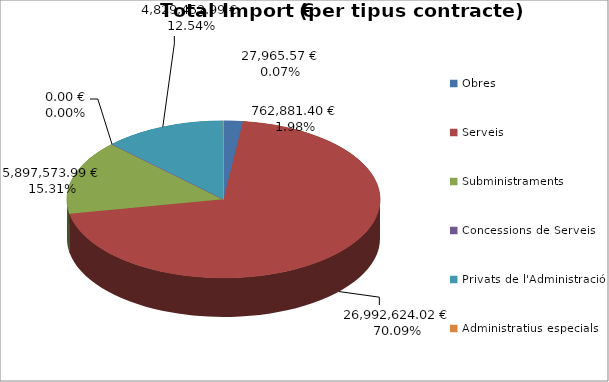
| Category | Total preu              (amb iva) |
|---|---|
| Obres | 762881.4 |
| Serveis | 26992624.02 |
| Subministraments | 5897573.99 |
| Concessions de Serveis | 0 |
| Privats de l'Administració | 4829452.99 |
| Administratius especials | 27965.57 |